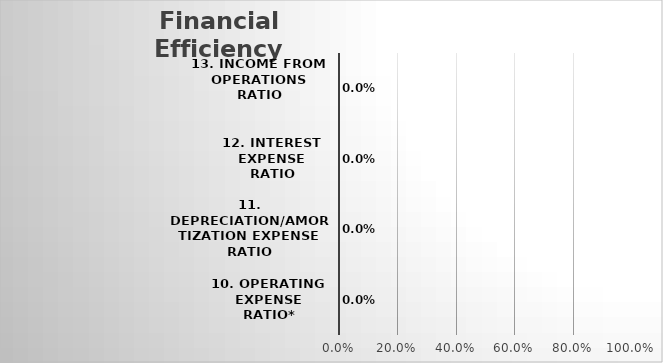
| Category | Series 0 |
|---|---|
| 10. Operating Expense Ratio* | 0 |
| 11. Depreciation/Amortization Expense Ratio | 0 |
| 12. Interest Expense Ratio | 0 |
| 13. Income from Operations Ratio | 0 |